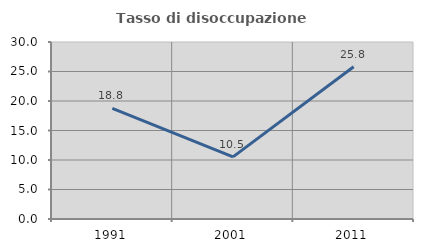
| Category | Tasso di disoccupazione giovanile  |
|---|---|
| 1991.0 | 18.75 |
| 2001.0 | 10.526 |
| 2011.0 | 25.806 |